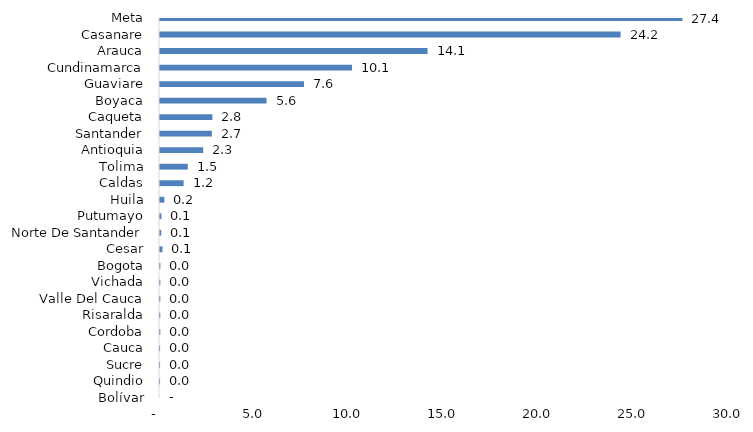
| Category | Series 0 |
|---|---|
| Bolívar | 0 |
| Quindio | 0.003 |
| Sucre | 0.003 |
| Cauca | 0.004 |
| Cordoba | 0.016 |
| Risaralda | 0.015 |
| Valle Del Cauca | 0.015 |
| Vichada | 0.018 |
| Bogota | 0.021 |
| Cesar | 0.13 |
| Norte De Santander | 0.065 |
| Putumayo | 0.072 |
| Huila | 0.227 |
| Caldas | 1.241 |
| Tolima | 1.46 |
| Antioquia | 2.27 |
| Santander | 2.724 |
| Caqueta | 2.751 |
| Boyaca | 5.597 |
| Guaviare | 7.566 |
| Cundinamarca | 10.09 |
| Arauca | 14.055 |
| Casanare | 24.198 |
| Meta | 27.447 |